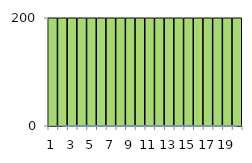
| Category | increment | normal |
|---|---|---|
| 0 | 1000 | 0 |
| 1 | 1000 | 0 |
| 2 | 1000 | 0 |
| 3 | 1000 | 0 |
| 4 | 1000 | 0 |
| 5 | 1000 | 0 |
| 6 | 1000 | 0 |
| 7 | 1000 | 0 |
| 8 | 1000 | 0 |
| 9 | 1000 | 0 |
| 10 | 1000 | 0 |
| 11 | 1000 | 0 |
| 12 | 1000 | 0 |
| 13 | 1000 | 0 |
| 14 | 1000 | 0 |
| 15 | 1000 | 0 |
| 16 | 1000 | 0 |
| 17 | 1000 | 0 |
| 18 | 1000 | 0 |
| 19 | 1000 | 0 |